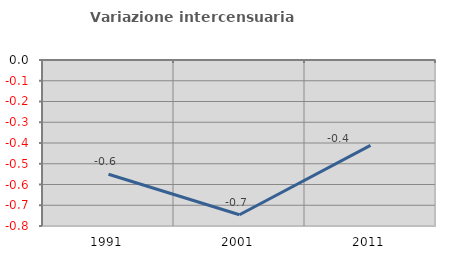
| Category | Variazione intercensuaria annua |
|---|---|
| 1991.0 | -0.551 |
| 2001.0 | -0.746 |
| 2011.0 | -0.411 |